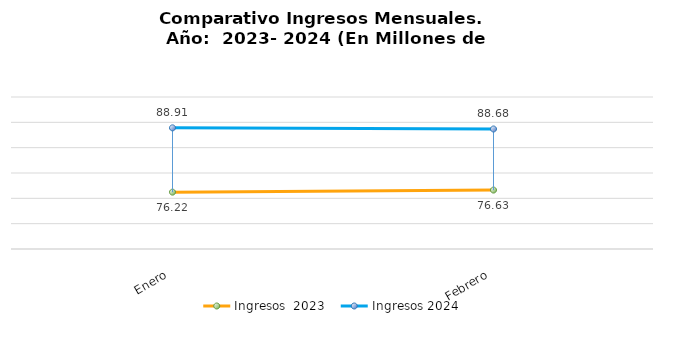
| Category | Ingresos  2023 | Ingresos 2024 |
|---|---|---|
| Enero | 76.222 | 88.911 |
| Febrero | 76.631 | 88.685 |